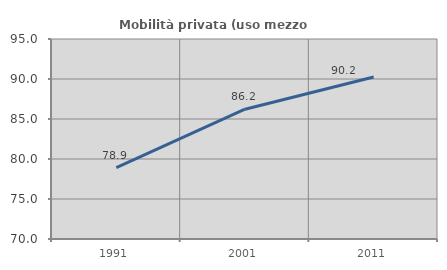
| Category | Mobilità privata (uso mezzo privato) |
|---|---|
| 1991.0 | 78.927 |
| 2001.0 | 86.222 |
| 2011.0 | 90.244 |